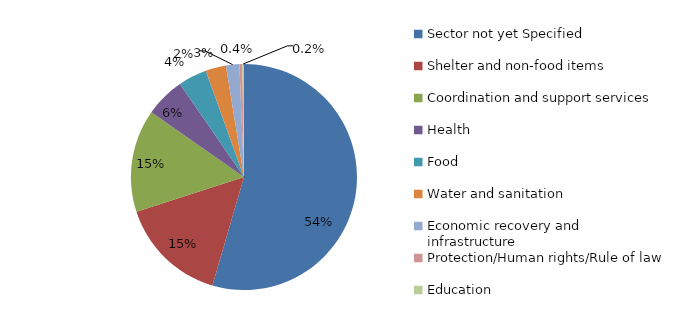
| Category | Sum of USD committed/contributed |
|---|---|
| Sector not yet Specified | 65316985 |
| Shelter and non-food items | 18578382 |
| Coordination and support services | 17593840 |
| Health | 6833219 |
| Food | 4923317 |
| Water and sanitation | 3500770 |
| Economic recovery and infrastructure | 2290468 |
| Protection/Human rights/Rule of law | 509320 |
| Education | 274299 |